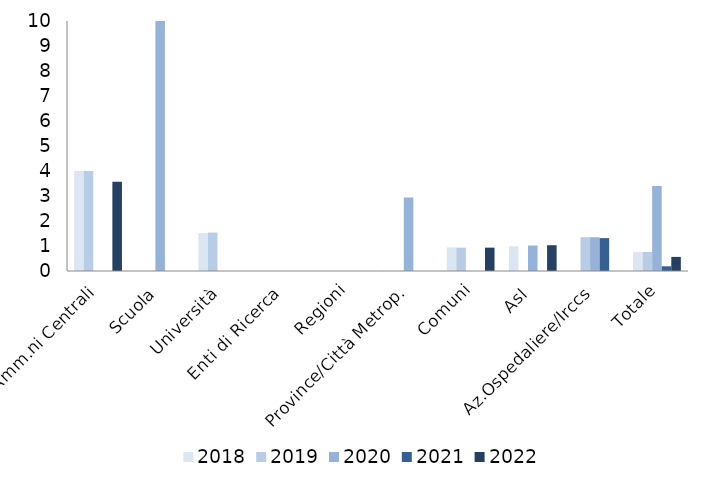
| Category | 2018 | 2019 | 2020 | 2021 | 2022 |
|---|---|---|---|---|---|
| Amm.ni Centrali | 4 | 4 | 0 | 0 | 3.571 |
| Scuola | 0 | 0 | 81.25 | 0 | 0 |
| Università | 1.515 | 1.538 | 0 | 0 | 0 |
| Enti di Ricerca | 0 | 0 | 0 | 0 | 0 |
| Regioni | 0 | 0 | 0 | 0 | 0 |
| Province/Città Metrop. | 0 | 0 | 2.941 | 0 | 0 |
| Comuni | 0.943 | 0.935 | 0 | 0 | 0.935 |
| Asl | 0.99 | 0 | 1.02 | 0 | 1.031 |
| Az.Ospedaliere/Irccs | 0 | 1.351 | 1.351 | 1.316 | 0 |
| Totale | 0.755 | 0.765 | 3.403 | 0.188 | 0.564 |